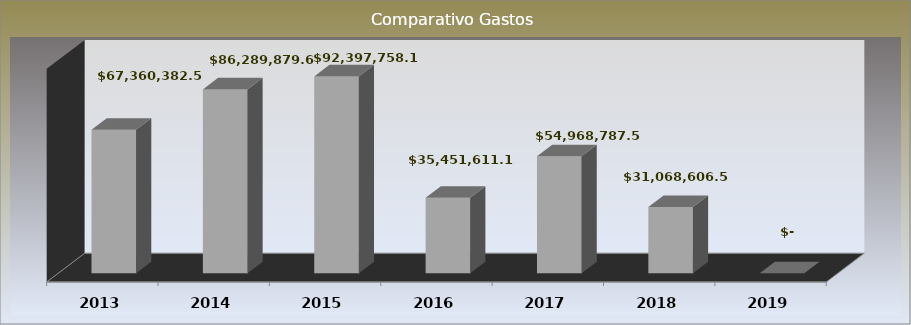
| Category | Series 0 |
|---|---|
| 2013.0 | 67360382.57 |
| 2014.0 | 86289879.62 |
| 2015.0 | 92397758.15 |
| 2016.0 | 35451611.18 |
| 2017.0 | 54968787.54 |
| 2018.0 | 31068606.51 |
| 2019.0 | 0 |